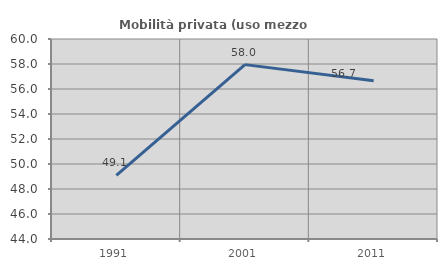
| Category | Mobilità privata (uso mezzo privato) |
|---|---|
| 1991.0 | 49.084 |
| 2001.0 | 57.951 |
| 2011.0 | 56.667 |